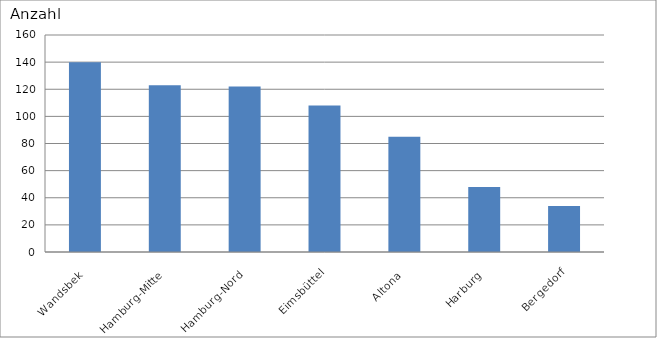
| Category | Wandsbek Hamburg-Mitte Hamburg-Nord Eimsbüttel Altona Harburg Bergedorf |
|---|---|
| Wandsbek | 140 |
| Hamburg-Mitte | 123 |
| Hamburg-Nord | 122 |
| Eimsbüttel | 108 |
| Altona | 85 |
| Harburg | 48 |
| Bergedorf | 34 |